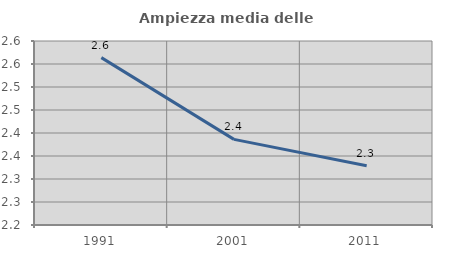
| Category | Ampiezza media delle famiglie |
|---|---|
| 1991.0 | 2.564 |
| 2001.0 | 2.386 |
| 2011.0 | 2.329 |